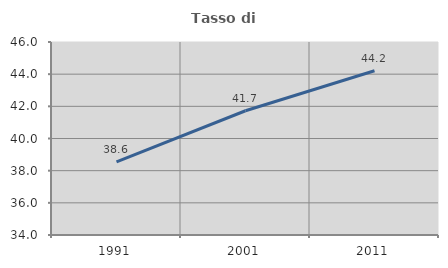
| Category | Tasso di occupazione   |
|---|---|
| 1991.0 | 38.551 |
| 2001.0 | 41.726 |
| 2011.0 | 44.209 |